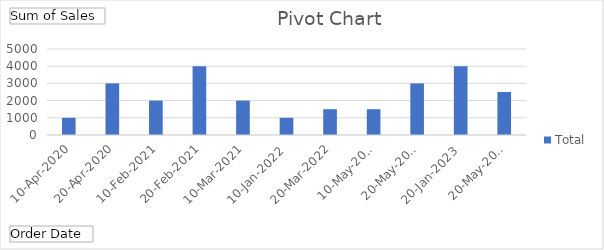
| Category | Total |
|---|---|
| 10-Apr-2020 | 1000 |
| 20-Apr-2020 | 3000 |
| 10-Feb-2021 | 2000 |
| 20-Feb-2021 | 4000 |
| 10-Mar-2021 | 2000 |
| 10-Jan-2022 | 1000 |
| 20-Mar-2022 | 1500 |
| 10-May-2022 | 1500 |
| 20-May-2022 | 3000 |
| 20-Jan-2023 | 4000 |
| 20-May-2023 | 2500 |